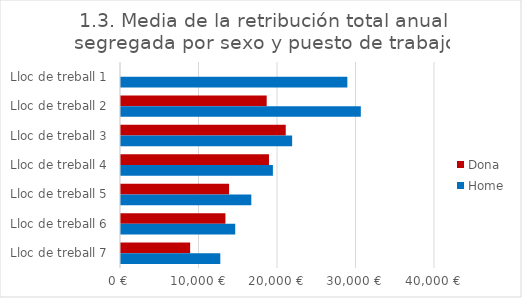
| Category | Dona | Home |
|---|---|---|
| Lloc de treball 1 | 0 | 28833.333 |
| Lloc de treball 2 | 18559 | 30550 |
| Lloc de treball 3 | 20984 | 21800 |
| Lloc de treball 4 | 18850 | 19350 |
| Lloc de treball 5 | 13766.667 | 16600 |
| Lloc de treball 6 | 13302.895 | 14550 |
| Lloc de treball 7 | 8808.5 | 12650 |